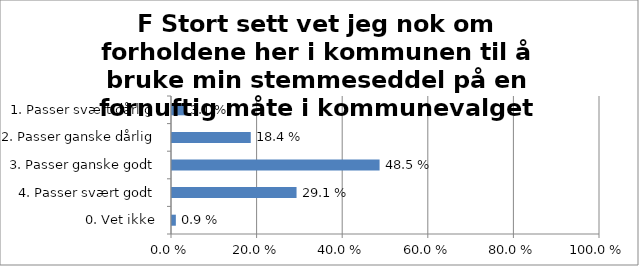
| Category | F Stort sett vet jeg nok om forholdene her i kommunen til å bruke min stemmeseddel på en fornuftig måte i kommunevalget |
|---|---|
| 1. Passer svært dårlig | 0.031 |
| 2. Passer ganske dårlig | 0.184 |
| 3. Passer ganske godt | 0.485 |
| 4. Passer svært godt | 0.291 |
| 0. Vet ikke | 0.009 |